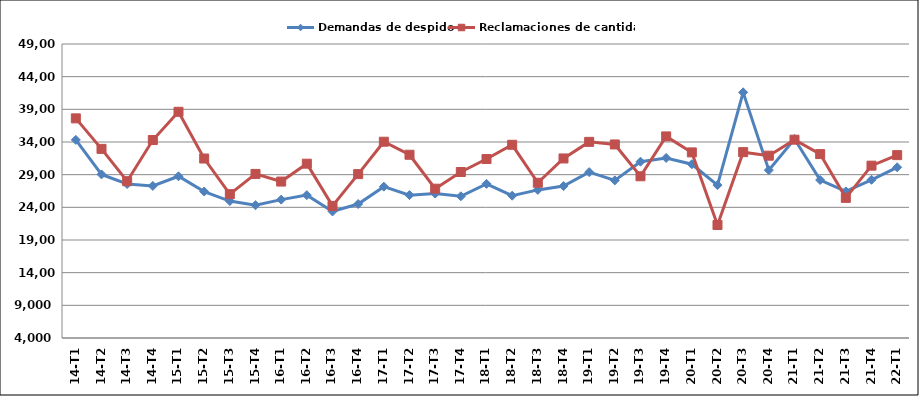
| Category | Demandas de despido | Reclamaciones de cantidad |
|---|---|---|
| 14-T1 | 34327 | 37617 |
| 14-T2 | 29037 | 32948 |
| 14-T3 | 27571 | 27999 |
| 14-T4 | 27278 | 34299 |
| 15-T1 | 28755 | 38621 |
| 15-T2 | 26417 | 31470 |
| 15-T3 | 24957 | 26018 |
| 15-T4 | 24328 | 29112 |
| 16-T1 | 25182 | 27945 |
| 16-T2 | 25866 | 30682 |
| 16-T3 | 23364 | 24220 |
| 16-T4 | 24509 | 29081 |
| 17-T1 | 27166 | 34041 |
| 17-T2 | 25869 | 32047 |
| 17-T3 | 26101 | 26854 |
| 17-T4 | 25688 | 29408 |
| 18-T1 | 27589 | 31392 |
| 18-T2 | 25785 | 33573 |
| 18-T3 | 26669 | 27761 |
| 18-T4 | 27251 | 31480 |
| 19-T1 | 29386 | 34020 |
| 19-T2 | 28121 | 33623 |
| 19-T3 | 30981 | 28752 |
| 19-T4 | 31561 | 34857 |
| 20-T1 | 30597 | 32408 |
| 20-T2 | 27401 | 21297 |
| 20-T3 | 41597 | 32446 |
| 20-T4 | 29692 | 31906 |
| 21-T1 | 34461 | 34356 |
| 21-T2 | 28179 | 32151 |
| 21-T3 | 26434 | 25447 |
| 21-T4 | 28219 | 30377 |
| 22-T1 | 30126 | 31990 |